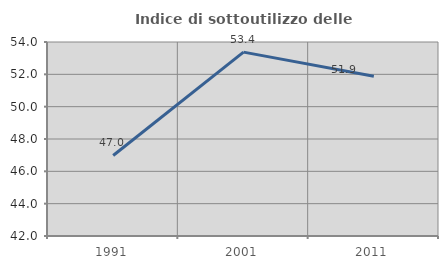
| Category | Indice di sottoutilizzo delle abitazioni  |
|---|---|
| 1991.0 | 46.98 |
| 2001.0 | 53.374 |
| 2011.0 | 51.887 |